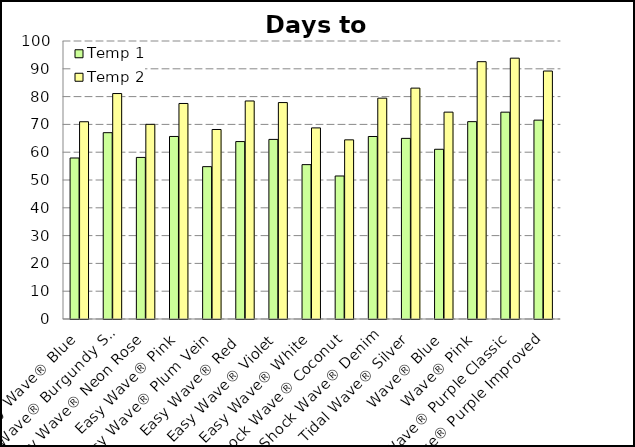
| Category | Temp 1 | Temp 2 |
|---|---|---|
| Easy Wave® Blue | 57.915 | 70.954 |
| Easy Wave® Burgundy Star | 67.024 | 81.101 |
| Easy Wave® Neon Rose | 58.117 | 70.024 |
| Easy Wave® Pink | 65.662 | 77.527 |
| Easy Wave® Plum Vein | 54.8 | 68.17 |
| Easy Wave® Red  | 63.824 | 78.423 |
| Easy Wave® Violet | 64.605 | 77.854 |
| Easy Wave® White | 55.529 | 68.74 |
| Shock Wave® Coconut | 51.443 | 64.444 |
| Shock Wave® Denim | 65.648 | 79.438 |
| Tidal Wave® Silver | 64.975 | 83.054 |
| Wave® Blue | 61.055 | 74.413 |
| Wave® Pink | 70.988 | 92.564 |
| Wave® Purple Classic | 74.4 | 93.825 |
| Wave® Purple Improved | 71.527 | 89.198 |